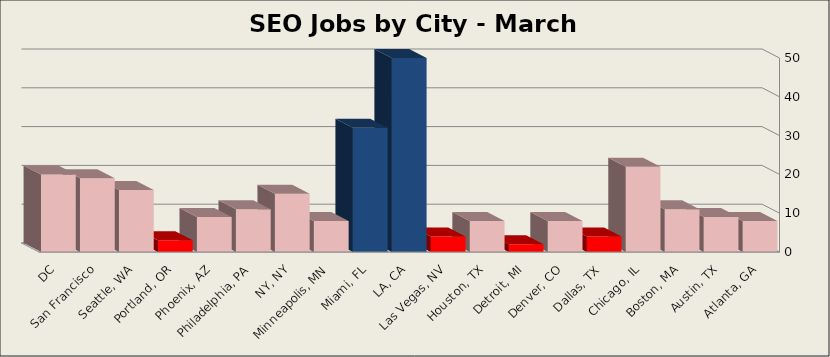
| Category | Series 0 |
|---|---|
| Atlanta, GA | 8 |
| Austin, TX | 9 |
| Boston, MA | 11 |
| Chicago, IL | 22 |
| Dallas, TX | 4 |
| Denver, CO | 8 |
| Detroit, MI | 2 |
| Houston, TX | 8 |
| Las Vegas, NV | 4 |
| LA, CA | 50 |
| Miami, FL | 32 |
| Minneapolis, MN | 8 |
| NY, NY | 15 |
| Philadelphia, PA | 11 |
| Phoenix, AZ | 9 |
| Portland, OR | 3 |
| Seattle, WA | 16 |
| San Francisco | 19 |
| DC | 20 |